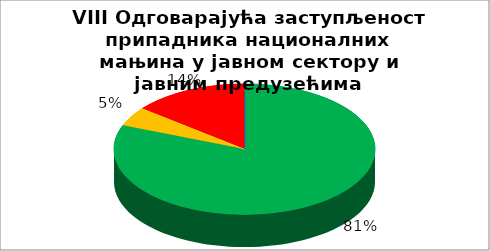
| Category | VIII Одговарајућа заступљеност припадника националних мањина у јавном сектору и јавним предузећима |
|---|---|
| 0 | 0.81 |
| 1 | 0.048 |
| 2 | 0 |
| 3 | 0.143 |
| 4 | 0 |